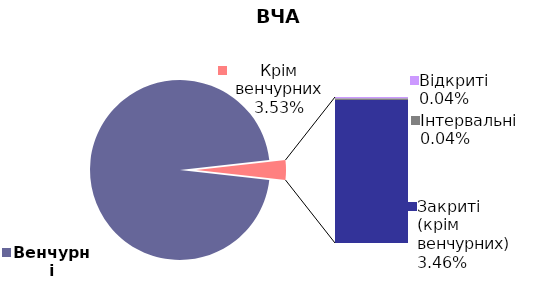
| Category | 30.09.2018 |
|---|---|
| Венчурні | 0.965 |
| Відкриті | 0 |
| Інтервальні | 0 |
| Закриті (крім венчурних) | 0.035 |